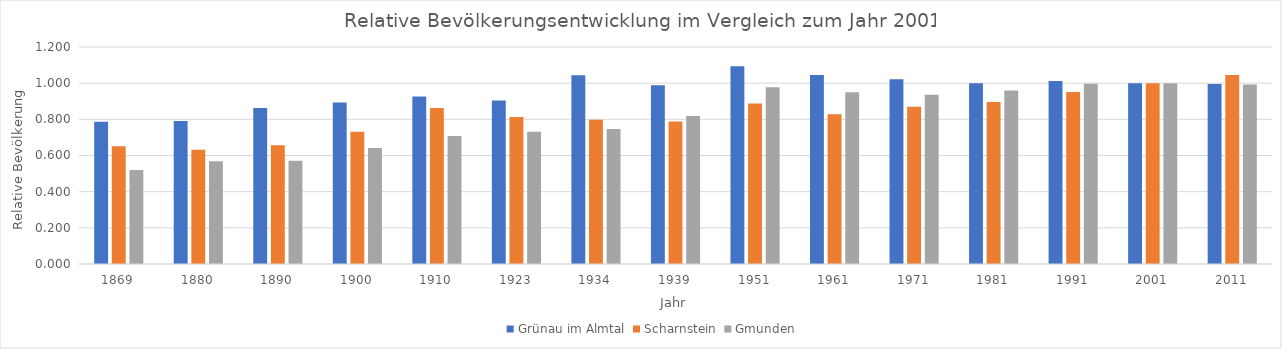
| Category | Grünau im Almtal | Scharnstein | Gmunden |
|---|---|---|---|
| 1869.0 | 0.787 | 0.651 | 0.52 |
| 1880.0 | 0.791 | 0.632 | 0.568 |
| 1890.0 | 0.863 | 0.657 | 0.57 |
| 1900.0 | 0.893 | 0.731 | 0.641 |
| 1910.0 | 0.927 | 0.863 | 0.708 |
| 1923.0 | 0.904 | 0.812 | 0.731 |
| 1934.0 | 1.044 | 0.797 | 0.746 |
| 1939.0 | 0.989 | 0.788 | 0.819 |
| 1951.0 | 1.093 | 0.888 | 0.978 |
| 1961.0 | 1.045 | 0.829 | 0.949 |
| 1971.0 | 1.022 | 0.869 | 0.935 |
| 1981.0 | 1 | 0.896 | 0.96 |
| 1991.0 | 1.012 | 0.951 | 0.996 |
| 2001.0 | 1 | 1 | 1 |
| 2011.0 | 0.995 | 1.045 | 0.993 |